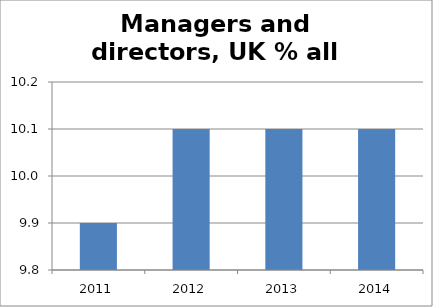
| Category | 1: Managers & directors |
|---|---|
| 2011.0 | 9.9 |
| 2012.0 | 10.1 |
| 2013.0 | 10.1 |
| 2014.0 | 10.1 |